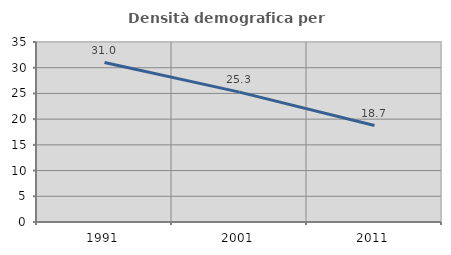
| Category | Densità demografica |
|---|---|
| 1991.0 | 30.999 |
| 2001.0 | 25.256 |
| 2011.0 | 18.749 |